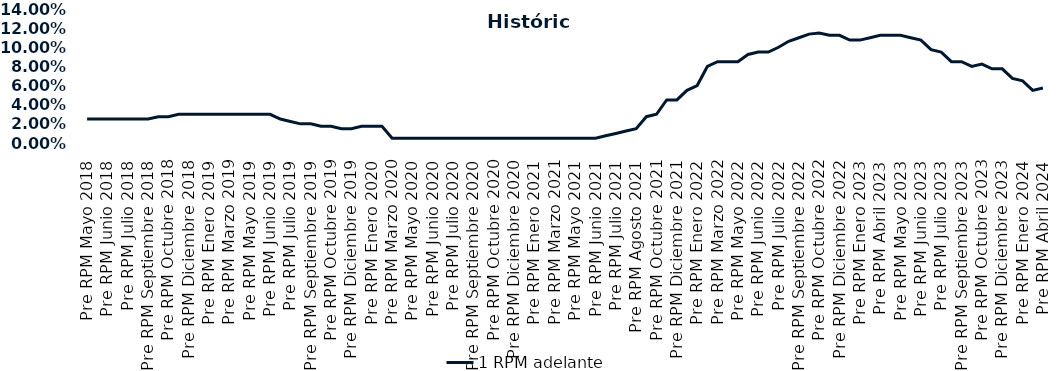
| Category | 1 RPM adelante |
|---|---|
| Pre RPM Mayo 2018 | 0.025 |
| Post RPM Mayo 2018 | 0.025 |
| Pre RPM Junio 2018 | 0.025 |
| Post RPM Junio 2018 | 0.025 |
| Pre RPM Julio 2018 | 0.025 |
| Post RPM Julio 2018 | 0.025 |
| Pre RPM Septiembre 2018 | 0.025 |
| Post RPM Septiembre 2018 | 0.028 |
| Pre RPM Octubre 2018 | 0.028 |
| Post RPM Octubre 2018 | 0.03 |
| Pre RPM Diciembre 2018 | 0.03 |
| Post RPM Diciembre 2018 | 0.03 |
| Pre RPM Enero 2019 | 0.03 |
| Post RPM Enero 2019 | 0.03 |
| Pre RPM Marzo 2019 | 0.03 |
| Post RPM Marzo 2019 | 0.03 |
| Pre RPM Mayo 2019 | 0.03 |
| Post RPM Mayo 2019 | 0.03 |
| Pre RPM Junio 2019 | 0.03 |
| Post RPM Junio 2019 | 0.025 |
| Pre RPM Julio 2019 | 0.022 |
| Post RPM Julio 2019 | 0.02 |
| Pre RPM Septiembre 2019 | 0.02 |
| Post RPM Septiembre 2019 | 0.018 |
| Pre RPM Octubre 2019 | 0.018 |
| Post RPM Octubre 2019 | 0.015 |
| Pre RPM Diciembre 2019 | 0.015 |
| Post RPM Diciembre 2019 | 0.018 |
| Pre RPM Enero 2020 | 0.018 |
| Post RPM Enero 2020 | 0.018 |
| Pre RPM Marzo 2020 | 0.005 |
| Post RPM Marzo 2020 | 0.005 |
| Pre RPM Mayo 2020 | 0.005 |
| Post RPM Mayo 2020 | 0.005 |
| Pre RPM Junio 2020 | 0.005 |
| Post RPM Junio 2020 | 0.005 |
| Pre RPM Julio 2020 | 0.005 |
| Post RPM Julio 2020 | 0.005 |
| Pre RPM Septiembre 2020 | 0.005 |
| Post RPM Septiembre 2020 | 0.005 |
| Pre RPM Octubre 2020 | 0.005 |
| Post RPM Octubre 2020 | 0.005 |
| Pre RPM Diciembre 2020 | 0.005 |
| Post RPM Diciembre 2020 | 0.005 |
| Pre RPM Enero 2021 | 0.005 |
| Post RPM Enero 2021 | 0.005 |
| Pre RPM Marzo 2021 | 0.005 |
| Post RPM Marzo 2021 | 0.005 |
| Pre RPM Mayo 2021 | 0.005 |
| Post RPM Mayo 2021 | 0.005 |
| Pre RPM Junio 2021 | 0.005 |
| Post RPM Junio 2021 | 0.008 |
| Pre RPM Julio 2021 | 0.01 |
| Post RPM Julio 2021 | 0.012 |
| Pre RPM Agosto 2021 | 0.015 |
| Post RPM Agosto 2021 | 0.028 |
| Pre RPM Octubre 2021 | 0.03 |
| Post RPM Octubre 2021 | 0.045 |
| Pre RPM Diciembre 2021 | 0.045 |
| Post RPM Diciembre 2021 | 0.055 |
| Pre RPM Enero 2022 | 0.06 |
| Post RPM Enero 2022 | 0.08 |
| Pre RPM Marzo 2022 | 0.085 |
| Post RPM Marzo 2022 | 0.085 |
| Pre RPM Mayo 2022 | 0.085 |
| Post RPM Mayo 2022 | 0.092 |
| Pre RPM Junio 2022 | 0.095 |
| Post RPM Junio 2022 | 0.095 |
| Pre RPM Julio 2022 | 0.1 |
| Post RPM Julio 2022 | 0.106 |
| Pre RPM Septiembre 2022 | 0.11 |
| Post RPM Septiembre 2022 | 0.114 |
| Pre RPM Octubre 2022 | 0.115 |
| Post RPM Octubre 2022 | 0.112 |
| Pre RPM Diciembre 2022 | 0.112 |
| Post RPM Diciembre 2022 | 0.108 |
| Pre RPM Enero 2023 | 0.108 |
| Post RPM Enero 2023 | 0.11 |
| Pre RPM Abril 2023 | 0.112 |
| Post RPM Abril 2023 | 0.112 |
| Pre RPM Mayo 2023 | 0.112 |
| Post RPM Mayo 2023 | 0.11 |
| Pre RPM Junio 2023 | 0.108 |
| Post RPM Junio 2023 | 0.098 |
| Pre RPM Julio 2023 | 0.095 |
| Post RPM Julio 2023 | 0.085 |
| Pre RPM Septiembre 2023 | 0.085 |
| Post RPM Septiembre 2023 | 0.08 |
| Pre RPM Octubre 2023 | 0.082 |
| Post RPM Octubre 2023 | 0.078 |
| Pre RPM Diciembre 2023 | 0.078 |
| Post RPM Diciembre 2023 | 0.068 |
| Pre RPM Enero 2024 | 0.065 |
| Post RPM Enero 2024 | 0.055 |
| Pre RPM Abril 2024 | 0.058 |